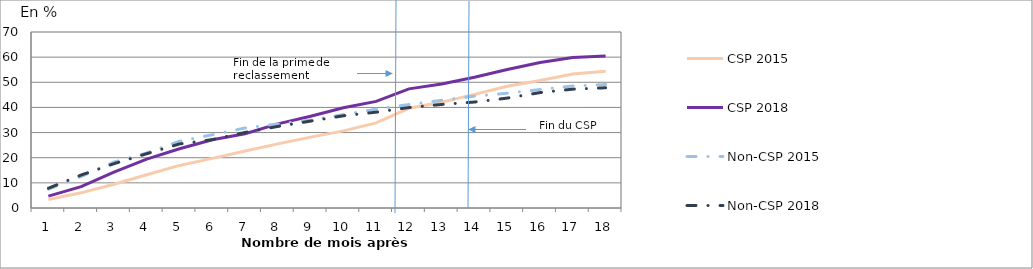
| Category | CSP 2015 | CSP 2018 | Non-CSP 2015 | Non-CSP 2018 |
|---|---|---|---|---|
| 0 | 3.367 | 4.704 | 7.49 | 7.855 |
| 1 | 6.033 | 8.479 | 12.548 | 13.115 |
| 2 | 9.433 | 14.286 | 18.246 | 17.623 |
| 3 | 13.233 | 19.454 | 21.895 | 21.585 |
| 4 | 16.933 | 23.577 | 26.569 | 25.478 |
| 5 | 19.733 | 27.12 | 29.129 | 27.186 |
| 6 | 22.699 | 29.559 | 31.818 | 30.055 |
| 7 | 25.499 | 33.449 | 33.419 | 32.445 |
| 8 | 28.199 | 36.469 | 34.955 | 34.563 |
| 9 | 30.666 | 39.837 | 37.132 | 36.68 |
| 10 | 33.832 | 42.393 | 39.309 | 38.115 |
| 11 | 39.665 | 47.387 | 41.165 | 39.959 |
| 12 | 42.065 | 49.303 | 42.83 | 41.189 |
| 13 | 45.198 | 51.974 | 44.494 | 42.145 |
| 14 | 48.398 | 55.11 | 45.647 | 43.716 |
| 15 | 50.732 | 57.898 | 47.119 | 45.902 |
| 16 | 53.332 | 59.814 | 48.528 | 47.268 |
| 17 | 54.365 | 60.453 | 49.104 | 47.814 |